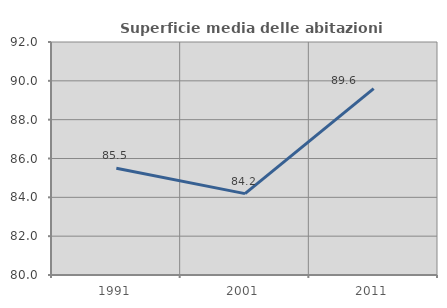
| Category | Superficie media delle abitazioni occupate |
|---|---|
| 1991.0 | 85.494 |
| 2001.0 | 84.192 |
| 2011.0 | 89.598 |